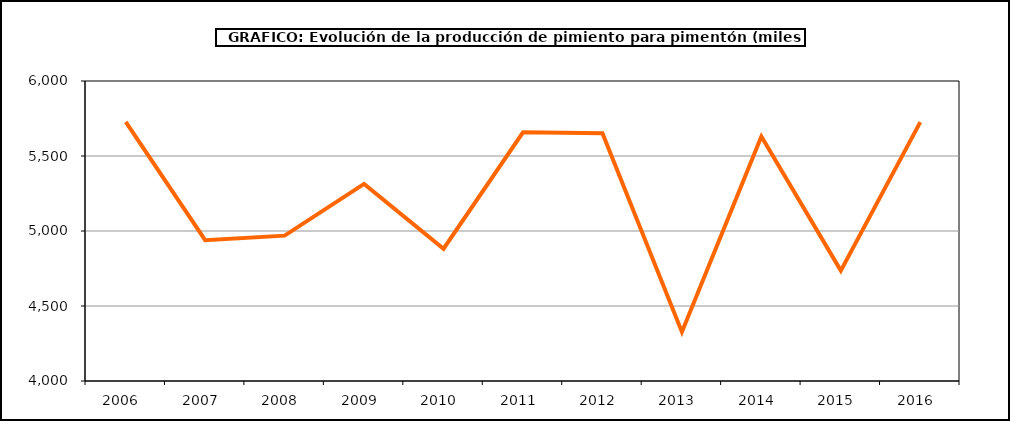
| Category | Producción |
|---|---|
| 2006.0 | 5727 |
| 2007.0 | 4939 |
| 2008.0 | 4969 |
| 2009.0 | 5314 |
| 2010.0 | 4882 |
| 2011.0 | 5658 |
| 2012.0 | 5652 |
| 2013.0 | 4327 |
| 2014.0 | 5630 |
| 2015.0 | 4736 |
| 2016.0 | 5726 |